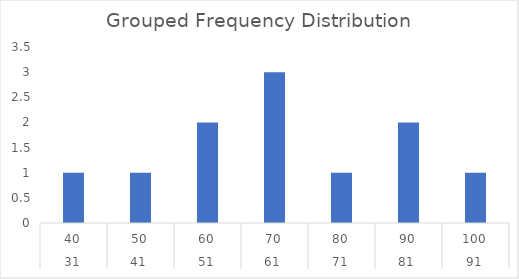
| Category | Series 0 |
|---|---|
| 0 | 1 |
| 1 | 1 |
| 2 | 2 |
| 3 | 3 |
| 4 | 1 |
| 5 | 2 |
| 6 | 1 |